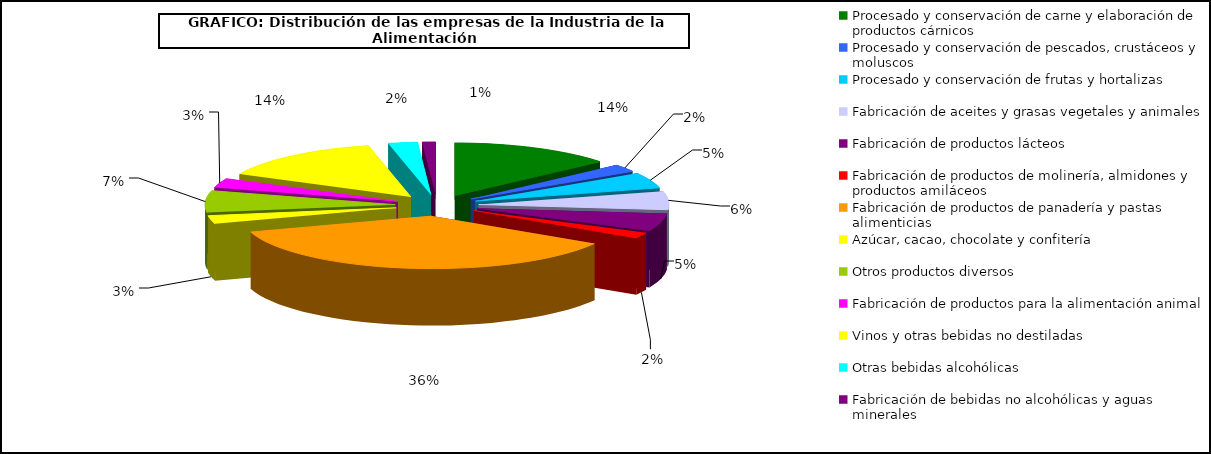
| Category | Series 0 |
|---|---|
| Procesado y conservación de carne y elaboración de productos cárnicos | 3926 |
| Procesado y conservación de pescados, crustáceos y moluscos | 656 |
| Procesado y conservación de frutas y hortalizas | 1353 |
| Fabricación de aceites y grasas vegetales y animales | 1605 |
| Fabricación de productos lácteos | 1536 |
| Fabricación de productos de molinería, almidones y productos amiláceos | 492 |
| Fabricación de productos de panadería y pastas alimenticias | 10314 |
| Azúcar, cacao, chocolate y confitería | 714 |
| Otros productos diversos | 1897 |
| Fabricación de productos para la alimentación animal | 812 |
| Vinos y otras bebidas no destiladas | 4047 |
| Otras bebidas alcohólicas | 701 |
| Fabricación de bebidas no alcohólicas y aguas minerales | 319 |